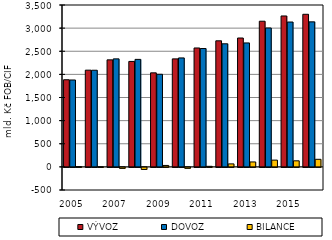
| Category | VÝVOZ | DOVOZ | BILANCE |
|---|---|---|---|
| 2005.0 | 1883.79 | 1878.625 | 5.165 |
| 2006.0 | 2091.052 | 2089.252 | 1.8 |
| 2007.0 | 2314.157 | 2335.398 | -21.241 |
| 2008.0 | 2279.85 | 2324.182 | -44.332 |
| 2009.0 | 2033.354 | 2002.287 | 31.067 |
| 2010.0 | 2334.842 | 2355.421 | -20.579 |
| 2011.0 | 2570.941 | 2558.964 | 11.977 |
| 2012.0 | 2725.844 | 2661.432 | 64.412 |
| 2013.0 | 2786.229 | 2679.71 | 106.518 |
| 2014.0 | 3149.196 | 3003.188 | 146.008 |
| 2015.0 | 3262.971 | 3131.994 | 130.977 |
| 2016.0 | 3299.106 | 3135.452 | 163.654 |